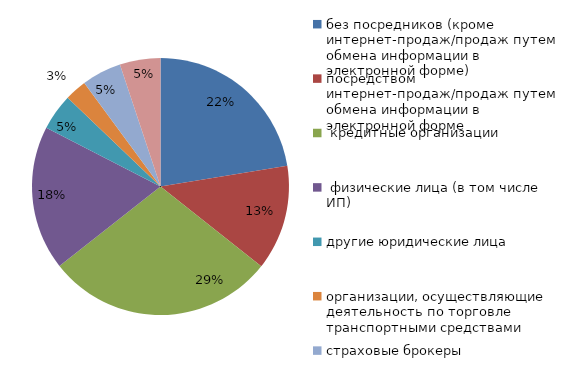
| Category | 3кв2022 |
|---|---|
| без посредников (кроме интернет-продаж/продаж путем обмена информации в электронной форме) | 0.224 |
| посредством интернет-продаж/продаж путем обмена информации в электронной форме | 0.132 |
|  кредитные организации | 0.287 |
|  физические лица (в том числе ИП) | 0.181 |
| другие юридические лица | 0.046 |
| организации, осуществляющие деятельность по торговле транспортными средствами | 0.027 |
| страховые брокеры | 0.05 |
| прочие  | 0.051 |